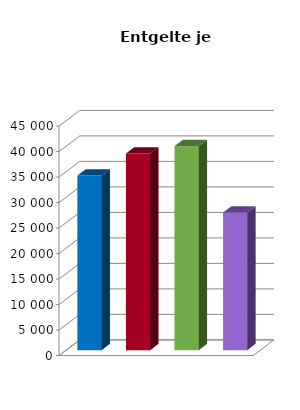
| Category | Entgelt je Beschäftigten |
|---|---|
| Vorl.güter/Energie | 34230.396 |
| Investitionsgüterproduzenten | 38575.944 |
| Gebrauchsgüterproduzenten | 40007.52 |
| Verbrauchsgüterproduzenten | 26967.645 |